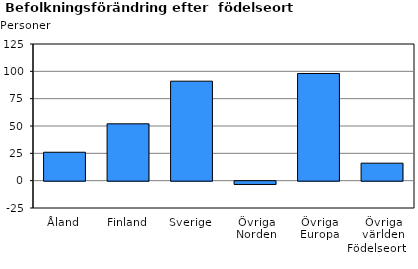
| Category | Series 0 |
|---|---|
| Åland | 26 |
| Finland | 52 |
| Sverige | 91 |
| Övriga Norden | -3 |
| Övriga Europa | 98 |
| Övriga världen | 16 |